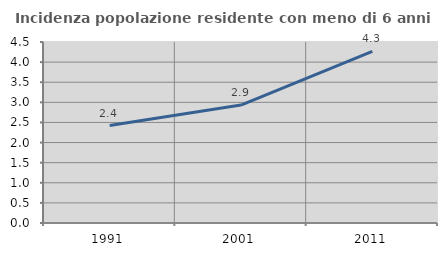
| Category | Incidenza popolazione residente con meno di 6 anni |
|---|---|
| 1991.0 | 2.422 |
| 2001.0 | 2.932 |
| 2011.0 | 4.265 |